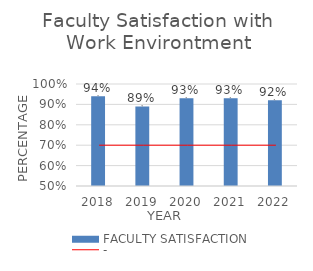
| Category | FACULTY SATISFACTION |
|---|---|
| 0 | 0.94 |
| 1 | 0.89 |
| 2 | 0.93 |
| 3 | 0.93 |
| 4 | 0.92 |